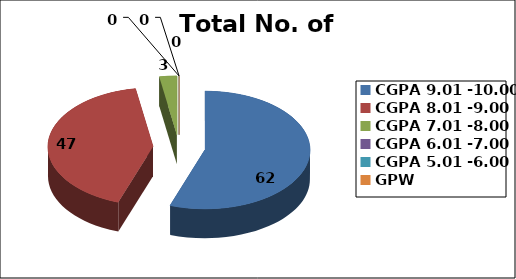
| Category | Total No. of Students |
|---|---|
| CGPA 9.01 -10.00 | 62 |
| CGPA 8.01 -9.00 | 47 |
| CGPA 7.01 -8.00 | 3 |
| CGPA 6.01 -7.00 | 0 |
| CGPA 5.01 -6.00 | 0 |
| GPW | 0 |